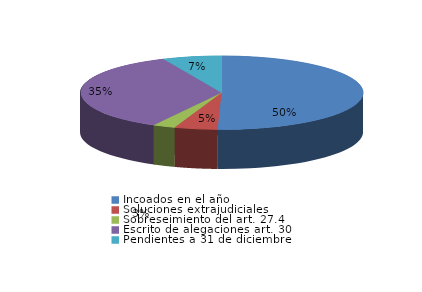
| Category | Series 0 |
|---|---|
| Incoados en el año | 1038 |
| Soluciones extrajudiciales | 101 |
| Sobreseimiento del art. 27.4 | 53 |
| Escrito de alegaciones art. 30 | 728 |
| Pendientes a 31 de diciembre | 138 |